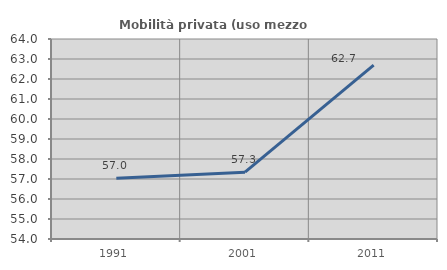
| Category | Mobilità privata (uso mezzo privato) |
|---|---|
| 1991.0 | 57.037 |
| 2001.0 | 57.343 |
| 2011.0 | 62.692 |